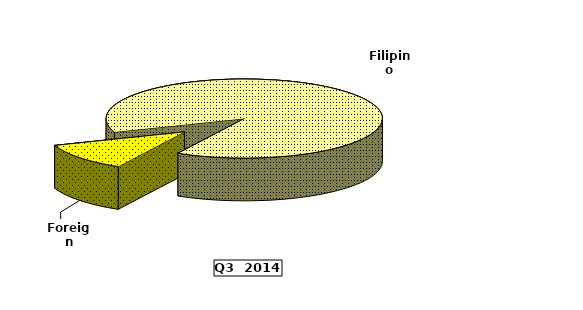
| Category | Series 0 |
|---|---|
| Filipino | 141.257 |
| Foreign | 18.314 |